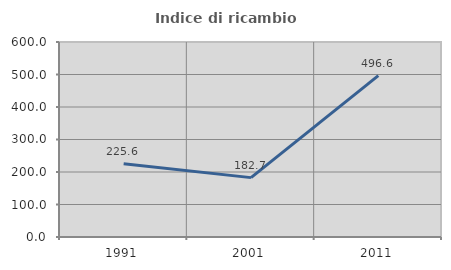
| Category | Indice di ricambio occupazionale  |
|---|---|
| 1991.0 | 225.641 |
| 2001.0 | 182.692 |
| 2011.0 | 496.552 |